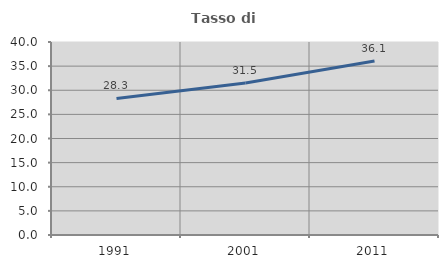
| Category | Tasso di occupazione   |
|---|---|
| 1991.0 | 28.291 |
| 2001.0 | 31.489 |
| 2011.0 | 36.053 |